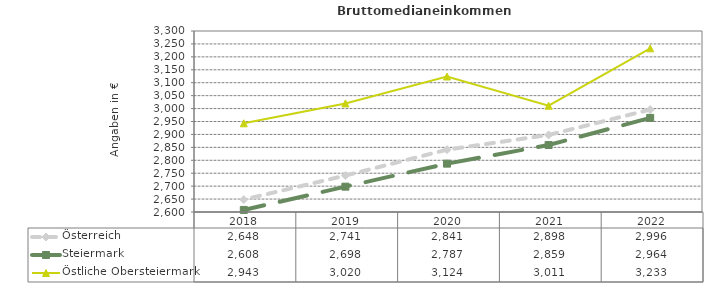
| Category | Österreich | Steiermark | Östliche Obersteiermark |
|---|---|---|---|
| 2022.0 | 2996 | 2964 | 3233 |
| 2021.0 | 2898 | 2859 | 3011 |
| 2020.0 | 2841 | 2787 | 3124 |
| 2019.0 | 2741 | 2698 | 3020 |
| 2018.0 | 2648 | 2608 | 2943 |